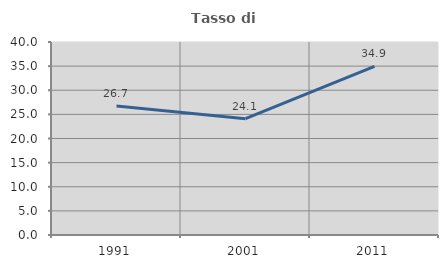
| Category | Tasso di occupazione   |
|---|---|
| 1991.0 | 26.727 |
| 2001.0 | 24.108 |
| 2011.0 | 34.943 |